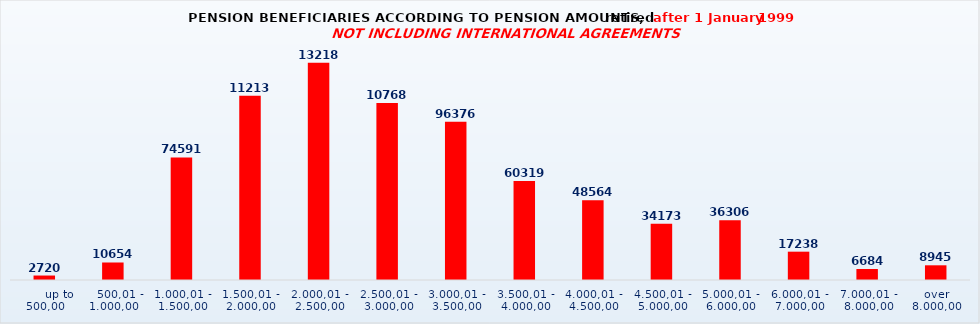
| Category | Series 0 |
|---|---|
|       up to 500,00 | 2720 |
|    500,01 - 1.000,00 | 10654 |
| 1.000,01 - 1.500,00 | 74591 |
| 1.500,01 - 2.000,00 | 112138 |
| 2.000,01 - 2.500,00 | 132185 |
| 2.500,01 - 3.000,00 | 107686 |
| 3.000,01 - 3.500,00 | 96376 |
| 3.500,01 - 4.000,00 | 60319 |
| 4.000,01 - 4.500,00 | 48564 |
| 4.500,01 - 5.000,00 | 34173 |
| 5.000,01 - 6.000,00 | 36306 |
| 6.000,01 - 7.000,00 | 17238 |
| 7.000,01 - 8.000,00 | 6684 |
| over 8.000,00 | 8945 |